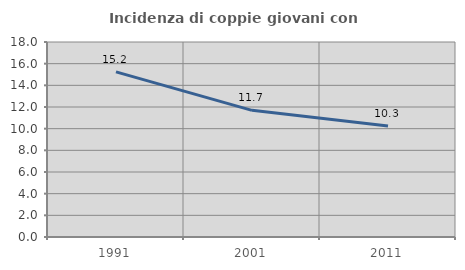
| Category | Incidenza di coppie giovani con figli |
|---|---|
| 1991.0 | 15.241 |
| 2001.0 | 11.693 |
| 2011.0 | 10.25 |